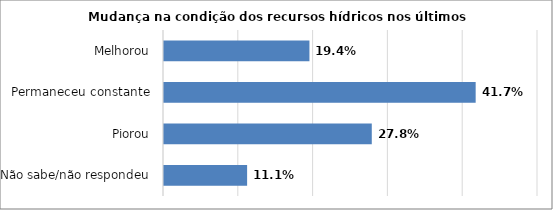
| Category | Series 0 |
|---|---|
| Não sabe/não respondeu | 0.111 |
| Piorou | 0.278 |
| Permaneceu constante | 0.417 |
| Melhorou | 0.194 |